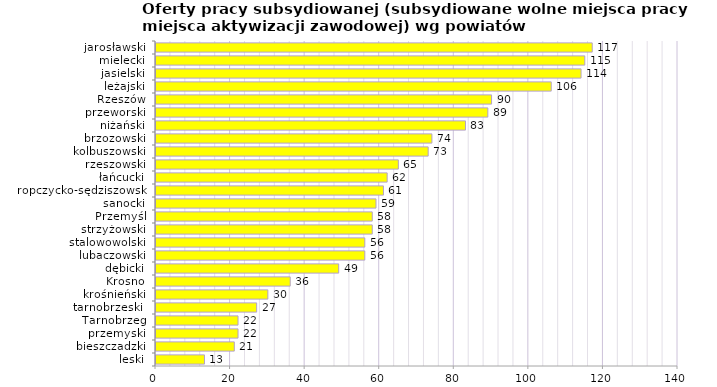
| Category | Oferty pracy subsydiowanej (subsydiowane wolne miejsca pracy i miejsca aktywizacji zawodowej) wg powiatów |
|---|---|
| leski | 13 |
| bieszczadzki | 21 |
| przemyski | 22 |
| Tarnobrzeg | 22 |
| tarnobrzeski  | 27 |
| krośnieński | 30 |
| Krosno | 36 |
| dębicki | 49 |
| lubaczowski | 56 |
| stalowowolski | 56 |
| strzyżowski | 58 |
| Przemyśl | 58 |
| sanocki | 59 |
| ropczycko-sędziszowski | 61 |
| łańcucki | 62 |
| rzeszowski | 65 |
| kolbuszowski | 73 |
| brzozowski | 74 |
| niżański | 83 |
| przeworski | 89 |
| Rzeszów | 90 |
| leżajski | 106 |
| jasielski | 114 |
| mielecki | 115 |
| jarosławski | 117 |